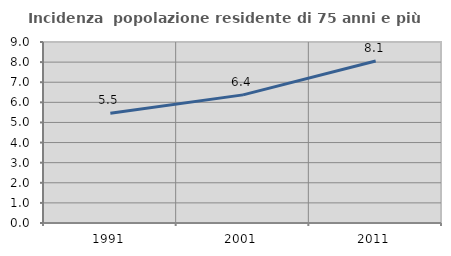
| Category | Incidenza  popolazione residente di 75 anni e più |
|---|---|
| 1991.0 | 5.452 |
| 2001.0 | 6.371 |
| 2011.0 | 8.057 |